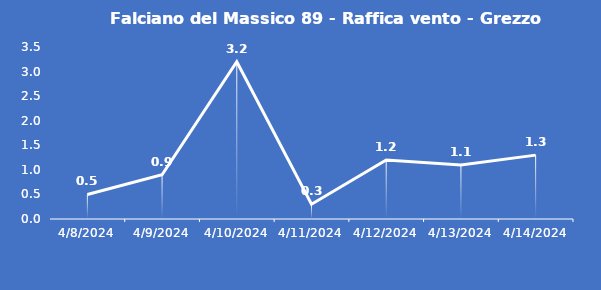
| Category | Falciano del Massico 89 - Raffica vento - Grezzo (m/s) |
|---|---|
| 4/8/24 | 0.5 |
| 4/9/24 | 0.9 |
| 4/10/24 | 3.2 |
| 4/11/24 | 0.3 |
| 4/12/24 | 1.2 |
| 4/13/24 | 1.1 |
| 4/14/24 | 1.3 |